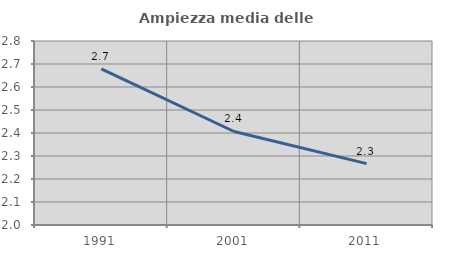
| Category | Ampiezza media delle famiglie |
|---|---|
| 1991.0 | 2.678 |
| 2001.0 | 2.407 |
| 2011.0 | 2.267 |